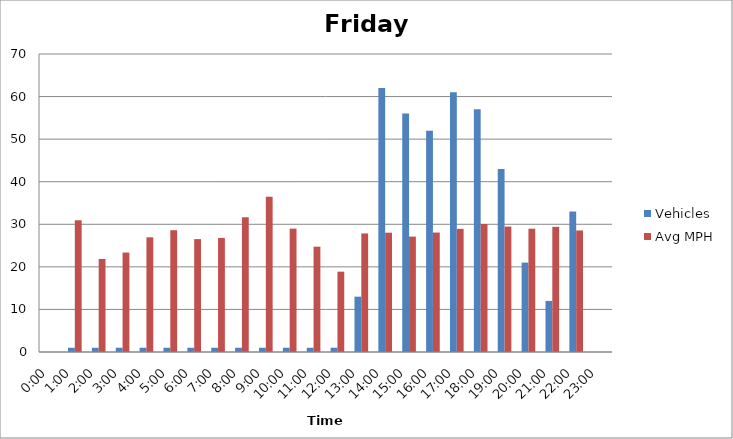
| Category | Vehicles | Avg MPH |
|---|---|---|
| 0:00 | 0 | 0 |
| 1:00 | 1 | 30.96 |
| 2:00 | 1 | 21.85 |
| 3:00 | 1 | 23.36 |
| 4:00 | 1 | 26.94 |
| 5:00 | 1 | 28.61 |
| 6:00 | 1 | 26.52 |
| 7:00 | 1 | 26.8 |
| 8:00 | 1 | 31.64 |
| 9:00 | 1 | 36.45 |
| 10:00 | 1 | 28.98 |
| 11:00 | 1 | 24.74 |
| 12:00 | 1 | 18.87 |
| 13:00 | 13 | 27.85 |
| 14:00 | 62 | 28.03 |
| 15:00 | 56 | 27.11 |
| 16:00 | 52 | 28.06 |
| 17:00 | 61 | 28.93 |
| 18:00 | 57 | 30.09 |
| 19:00 | 43 | 29.46 |
| 20:00 | 21 | 28.96 |
| 21:00 | 12 | 29.4 |
| 22:00 | 33 | 28.55 |
| 23:00 | 0 | 0 |